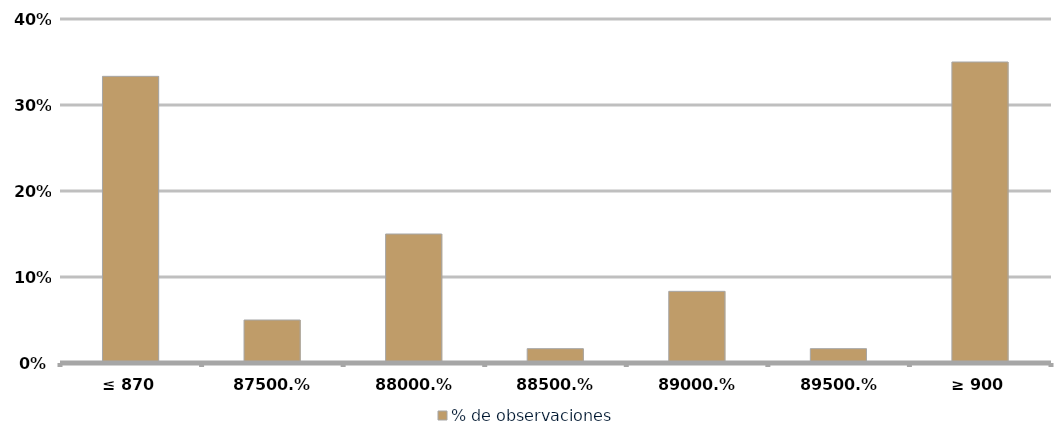
| Category | % de observaciones  |
|---|---|
| ≤ 870 | 0.333 |
| 875 | 0.05 |
| 880 | 0.15 |
| 885 | 0.017 |
| 890 | 0.083 |
| 895 | 0.017 |
| ≥ 900 | 0.35 |